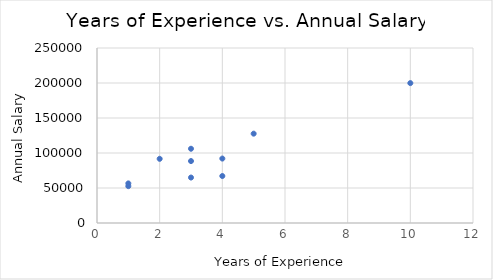
| Category | Sum of Years of Experience |
|---|---|
| 1.0 | 52621 |
| 1.0 | 56565 |
| 3.0 | 106079 |
| 2.0 | 91679 |
| 5.0 | 127626 |
| 4.0 | 67114 |
| 4.0 | 92058 |
| 10.0 | 199848 |
| 3.0 | 64937 |
| 3.0 | 88478 |